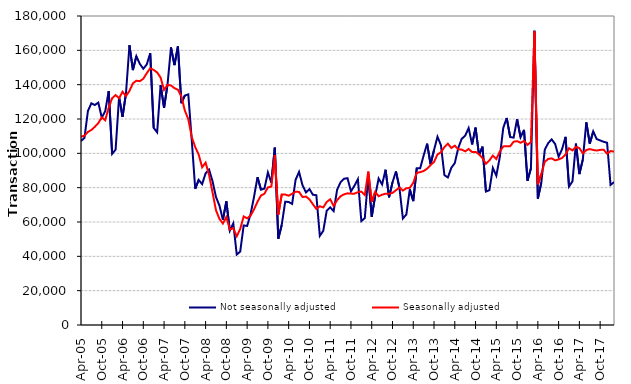
| Category | Not seasonally adjusted | Seasonally adjusted |
|---|---|---|
| 2005-04-01 | 107190 | 109680 |
| 2005-05-01 | 109010 | 110270 |
| 2005-06-01 | 124660 | 112460 |
| 2005-07-01 | 129170 | 113610 |
| 2005-08-01 | 128150 | 115470 |
| 2005-09-01 | 129560 | 117590 |
| 2005-10-01 | 120860 | 120990 |
| 2005-11-01 | 124540 | 119270 |
| 2005-12-01 | 136300 | 126640 |
| 2006-01-01 | 99740 | 132100 |
| 2006-02-01 | 102230 | 133940 |
| 2006-03-01 | 132710 | 132080 |
| 2006-04-01 | 121270 | 135880 |
| 2006-05-01 | 135030 | 133370 |
| 2006-06-01 | 162970 | 136400 |
| 2006-07-01 | 148490 | 140770 |
| 2006-08-01 | 156560 | 142280 |
| 2006-09-01 | 152100 | 142030 |
| 2006-10-01 | 149270 | 143440 |
| 2006-11-01 | 151770 | 146670 |
| 2006-12-01 | 158310 | 149510 |
| 2007-01-01 | 114880 | 148580 |
| 2007-02-01 | 112280 | 147120 |
| 2007-03-01 | 139780 | 144110 |
| 2007-04-01 | 126450 | 136980 |
| 2007-05-01 | 140110 | 139920 |
| 2007-06-01 | 161680 | 139530 |
| 2007-07-01 | 151390 | 137980 |
| 2007-08-01 | 162330 | 137040 |
| 2007-09-01 | 129210 | 133260 |
| 2007-10-01 | 133700 | 124980 |
| 2007-11-01 | 134320 | 119940 |
| 2007-12-01 | 107680 | 109440 |
| 2008-01-01 | 79350 | 103660 |
| 2008-02-01 | 84540 | 99300 |
| 2008-03-01 | 82050 | 91920 |
| 2008-04-01 | 88350 | 94610 |
| 2008-05-01 | 90570 | 87440 |
| 2008-06-01 | 83780 | 77280 |
| 2008-07-01 | 74560 | 66860 |
| 2008-08-01 | 69560 | 61820 |
| 2008-09-01 | 61330 | 59130 |
| 2008-10-01 | 72020 | 62890 |
| 2008-11-01 | 54910 | 55610 |
| 2008-12-01 | 59180 | 56400 |
| 2009-01-01 | 41060 | 51660 |
| 2009-02-01 | 42750 | 55930 |
| 2009-03-01 | 57990 | 63250 |
| 2009-04-01 | 57690 | 62120 |
| 2009-05-01 | 64640 | 63760 |
| 2009-06-01 | 74760 | 67390 |
| 2009-07-01 | 86090 | 71810 |
| 2009-08-01 | 78820 | 75400 |
| 2009-09-01 | 79480 | 76470 |
| 2009-10-01 | 88840 | 80170 |
| 2009-11-01 | 82910 | 80640 |
| 2009-12-01 | 103320 | 98940 |
| 2010-01-01 | 50230 | 64150 |
| 2010-02-01 | 58370 | 76080 |
| 2010-03-01 | 71830 | 76000 |
| 2010-04-01 | 71660 | 75310 |
| 2010-05-01 | 70560 | 76440 |
| 2010-06-01 | 84580 | 77630 |
| 2010-07-01 | 89190 | 77510 |
| 2010-08-01 | 81420 | 74550 |
| 2010-09-01 | 77250 | 74810 |
| 2010-10-01 | 79190 | 73220 |
| 2010-11-01 | 75890 | 70350 |
| 2010-12-01 | 75600 | 67650 |
| 2011-01-01 | 51900 | 69160 |
| 2011-02-01 | 54880 | 68480 |
| 2011-03-01 | 66600 | 71680 |
| 2011-04-01 | 68510 | 73230 |
| 2011-05-01 | 66340 | 69330 |
| 2011-06-01 | 78780 | 72710 |
| 2011-07-01 | 83180 | 74990 |
| 2011-08-01 | 85180 | 76120 |
| 2011-09-01 | 85530 | 76690 |
| 2011-10-01 | 77840 | 76530 |
| 2011-11-01 | 81110 | 76520 |
| 2011-12-01 | 84940 | 77350 |
| 2012-01-01 | 60530 | 77740 |
| 2012-02-01 | 62300 | 75730 |
| 2012-03-01 | 86720 | 89350 |
| 2012-04-01 | 63040 | 71770 |
| 2012-05-01 | 75350 | 77530 |
| 2012-06-01 | 85310 | 75030 |
| 2012-07-01 | 81880 | 75890 |
| 2012-08-01 | 90440 | 76510 |
| 2012-09-01 | 74390 | 76440 |
| 2012-10-01 | 83060 | 76930 |
| 2012-11-01 | 89450 | 78510 |
| 2012-12-01 | 80010 | 80030 |
| 2013-01-01 | 62060 | 78330 |
| 2013-02-01 | 64360 | 79630 |
| 2013-03-01 | 79000 | 79910 |
| 2013-04-01 | 72180 | 82790 |
| 2013-05-01 | 91270 | 88580 |
| 2013-06-01 | 91270 | 89050 |
| 2013-07-01 | 98710 | 89710 |
| 2013-08-01 | 105630 | 91040 |
| 2013-09-01 | 93680 | 93160 |
| 2013-10-01 | 101920 | 95000 |
| 2013-11-01 | 109670 | 99330 |
| 2013-12-01 | 104700 | 100600 |
| 2014-01-01 | 87280 | 103640 |
| 2014-02-01 | 85940 | 105610 |
| 2014-03-01 | 91570 | 103110 |
| 2014-04-01 | 94340 | 104460 |
| 2014-05-01 | 103110 | 102360 |
| 2014-06-01 | 108460 | 102190 |
| 2014-07-01 | 110280 | 101130 |
| 2014-08-01 | 114720 | 102540 |
| 2014-09-01 | 105170 | 100720 |
| 2014-10-01 | 114990 | 100840 |
| 2014-11-01 | 99010 | 99450 |
| 2014-12-01 | 103880 | 97210 |
| 2015-01-01 | 77750 | 93940 |
| 2015-02-01 | 78540 | 95900 |
| 2015-03-01 | 91490 | 98690 |
| 2015-04-01 | 86970 | 96680 |
| 2015-05-01 | 97800 | 100950 |
| 2015-06-01 | 114770 | 104020 |
| 2015-07-01 | 120610 | 104200 |
| 2015-08-01 | 109480 | 104150 |
| 2015-09-01 | 109160 | 106760 |
| 2015-10-01 | 119950 | 107120 |
| 2015-11-01 | 109370 | 106150 |
| 2015-12-01 | 113690 | 107250 |
| 2016-01-01 | 84030 | 104930 |
| 2016-02-01 | 91310 | 106540 |
| 2016-03-01 | 171370 | 171000 |
| 2016-04-01 | 73560 | 81970 |
| 2016-05-01 | 83000 | 87980 |
| 2016-06-01 | 102090 | 95060 |
| 2016-07-01 | 106040 | 96750 |
| 2016-08-01 | 108110 | 97060 |
| 2016-09-01 | 105400 | 95900 |
| 2016-10-01 | 98070 | 96450 |
| 2016-11-01 | 102440 | 97320 |
| 2016-12-01 | 109600 | 99300 |
| 2017-01-01 | 80710 | 102960 |
| 2017-02-01 | 83670 | 101710 |
| 2017-03-01 | 105640 | 103720 |
| 2017-04-01 | 87950 | 103060 |
| 2017-05-01 | 96460 | 99940 |
| 2017-06-01 | 118080 | 101900 |
| 2017-07-01 | 105600 | 102480 |
| 2017-08-01 | 112790 | 101940 |
| 2017-09-01 | 108310 | 101640 |
| 2017-10-01 | 107510 | 102000 |
| 2017-11-01 | 106730 | 102120 |
| 2017-12-01 | 106170 | 99800 |
| 2018-01-01 | 81580 | 101350 |
| 2018-02-01 | 83230 | 101010 |